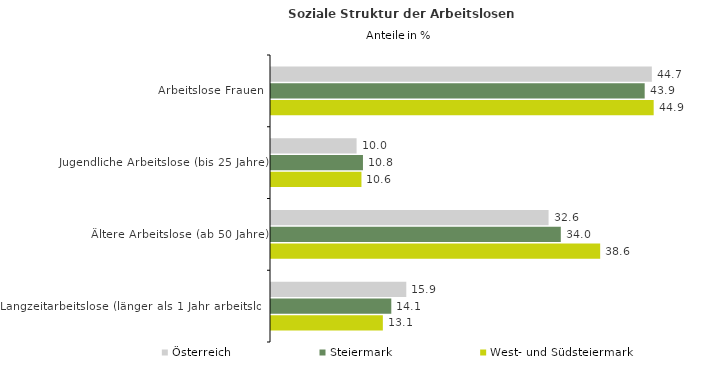
| Category | Österreich | Steiermark | West- und Südsteiermark |
|---|---|---|---|
| Arbeitslose Frauen | 44.699 | 43.86 | 44.915 |
| Jugendliche Arbeitslose (bis 25 Jahre) | 10.046 | 10.794 | 10.616 |
| Ältere Arbeitslose (ab 50 Jahre) | 32.578 | 34.015 | 38.635 |
| Langzeitarbeitslose (länger als 1 Jahr arbeitslos) | 15.879 | 14.12 | 13.128 |